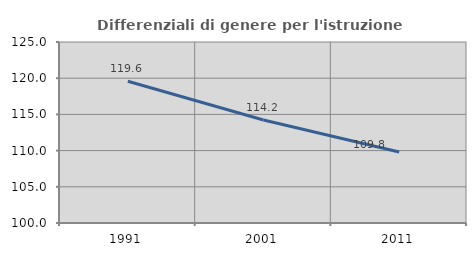
| Category | Differenziali di genere per l'istruzione superiore |
|---|---|
| 1991.0 | 119.577 |
| 2001.0 | 114.218 |
| 2011.0 | 109.811 |